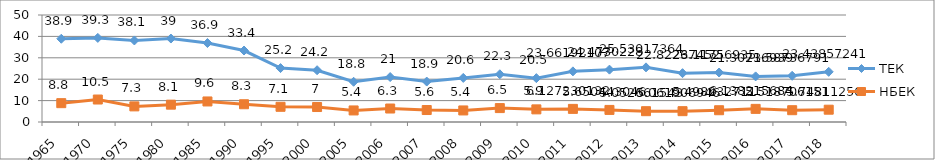
| Category | ТЕК | НБЕК |
|---|---|---|
| 1965.0 | 38.9 | 8.8 |
| 1970.0 | 39.3 | 10.5 |
| 1975.0 | 38.1 | 7.3 |
| 1980.0 | 39 | 8.1 |
| 1985.0 | 36.9 | 9.6 |
| 1990.0 | 33.4 | 8.3 |
| 1995.0 | 25.2 | 7.1 |
| 2000.0 | 24.2 | 7 |
| 2005.0 | 18.8 | 5.4 |
| 2006.0 | 21 | 6.3 |
| 2007.0 | 18.9 | 5.6 |
| 2008.0 | 20.6 | 5.4 |
| 2009.0 | 22.3 | 6.5 |
| 2010.0 | 20.5 | 5.9 |
| 2011.0 | 23.662 | 6.127 |
| 2012.0 | 24.473 | 5.65 |
| 2013.0 | 25.53 | 5.053 |
| 2014.0 | 22.823 | 5.062 |
| 2015.0 | 23.118 | 5.498 |
| 2016.0 | 21.307 | 6.138 |
| 2017.0 | 21.587 | 5.519 |
| 2018.0 | 23.439 | 5.748 |